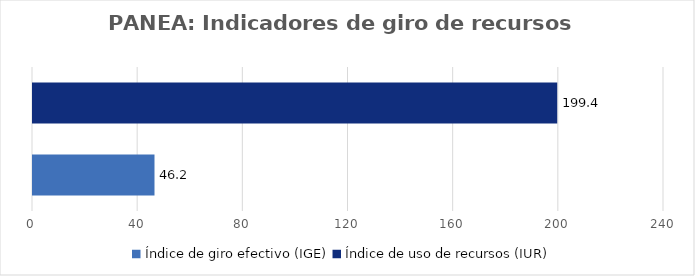
| Category | Series 0 |
|---|---|
| Índice de giro efectivo (IGE) | 46.21 |
| Índice de uso de recursos (IUR)  | 199.386 |